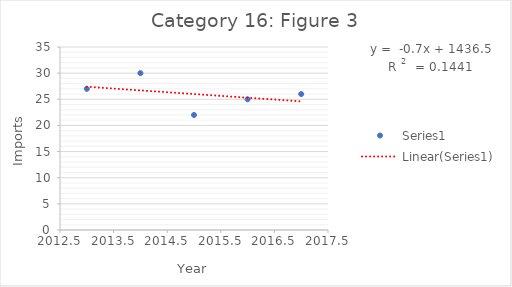
| Category | Series 0 |
|---|---|
| 2013.0 | 27 |
| 2014.0 | 30 |
| 2015.0 | 22 |
| 2016.0 | 25 |
| 2017.0 | 26 |